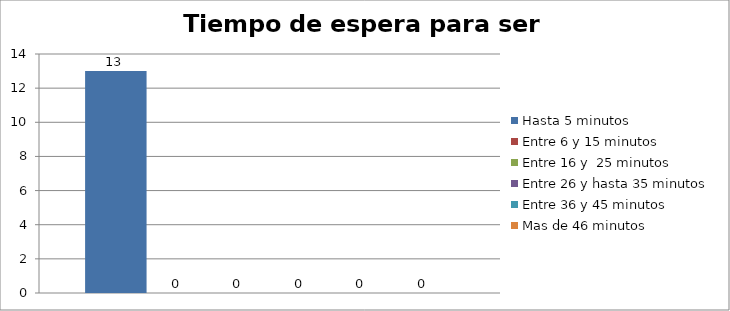
| Category | Hasta 5 minutos | Entre 6 y 15 minutos  | Entre 16 y  25 minutos | Entre 26 y hasta 35 minutos | Entre 36 y 45 minutos  | Mas de 46 minutos |
|---|---|---|---|---|---|---|
| 0 | 13 | 0 | 0 | 0 | 0 | 0 |